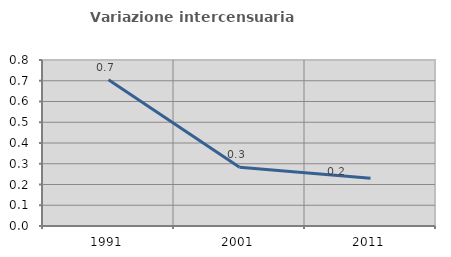
| Category | Variazione intercensuaria annua |
|---|---|
| 1991.0 | 0.705 |
| 2001.0 | 0.283 |
| 2011.0 | 0.231 |